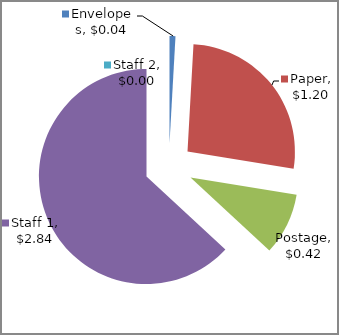
| Category | Series 0 |
|---|---|
| 0 | 0.04 |
| 1 | 1.2 |
| 2 | 0.42 |
| 3 | 2.84 |
| 4 | 0 |